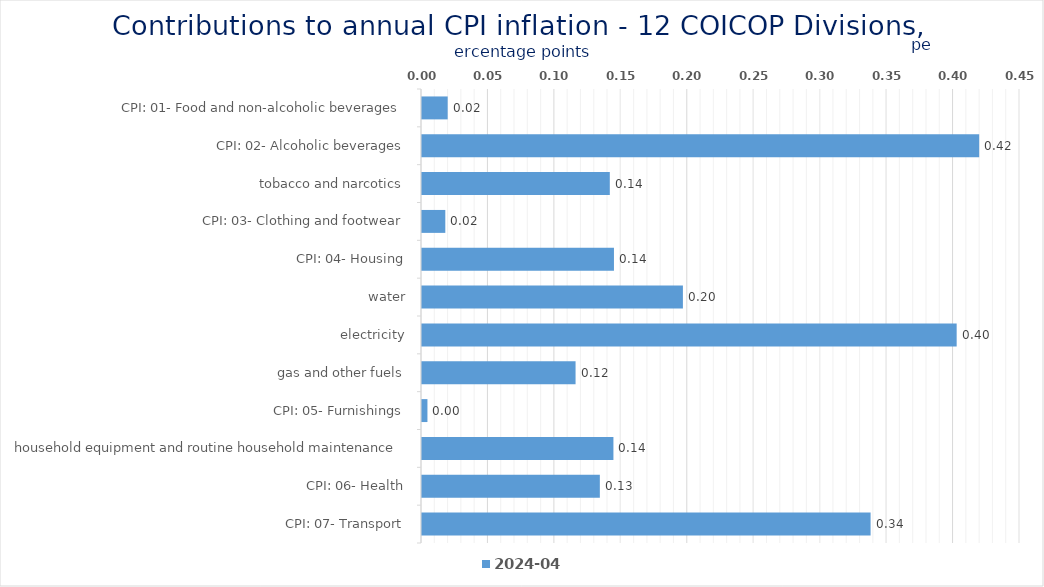
| Category | 2024-04 |
|---|---|
| CPI: 01- Food and non-alcoholic beverages | 0.019 |
| CPI: 02- Alcoholic beverages, tobacco and narcotics | 0.419 |
| CPI: 03- Clothing and footwear | 0.141 |
| CPI: 04- Housing, water, electricity, gas and other fuels | 0.018 |
| CPI: 05- Furnishings, household equipment and routine household maintenance | 0.144 |
| CPI: 06- Health | 0.196 |
| CPI: 07- Transport | 0.402 |
| CPI: 08- Communication | 0.116 |
| CPI: 09- Recreation and culture | 0.004 |
| CPI: 10- Education | 0.144 |
| CPI: 11- Restaurants and hotels | 0.134 |
| CPI: 12- Miscellaneous goods and services | 0.338 |